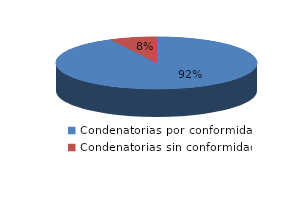
| Category | Series 0 |
|---|---|
| 0 | 417 |
| 1 | 34 |